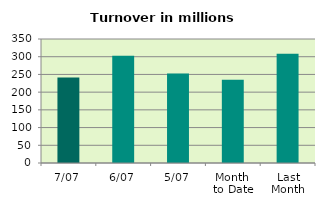
| Category | Series 0 |
|---|---|
| 7/07 | 241.535 |
| 6/07 | 302.463 |
| 5/07 | 252.416 |
| Month 
to Date | 234.982 |
| Last
Month | 308.534 |